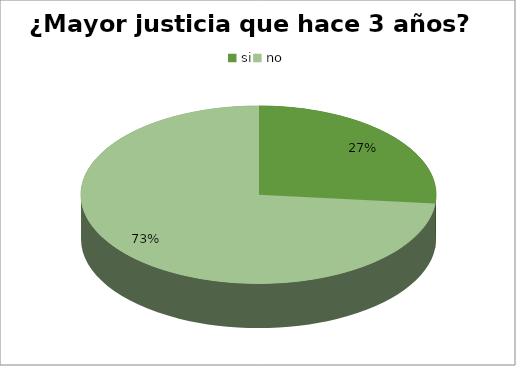
| Category | Series 0 |
|---|---|
| si | 25 |
| no | 69 |